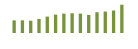
| Category | Saldo [ (1)-(2) ] |
|---|---|
| 0 | 203117.024 |
| 1 | 204244.864 |
| 2 | 198400.412 |
| 3 | 227324.117 |
| 4 | 264760.339 |
| 5 | 296419.004 |
| 6 | 312165.442 |
| 7 | 318321.614 |
| 8 | 312463.312 |
| 9 | 291587.274 |
| 10 | 334649.348 |
| 11 | 344816.778 |
| 12 | 363008.511 |
| 13 | 456436.244 |